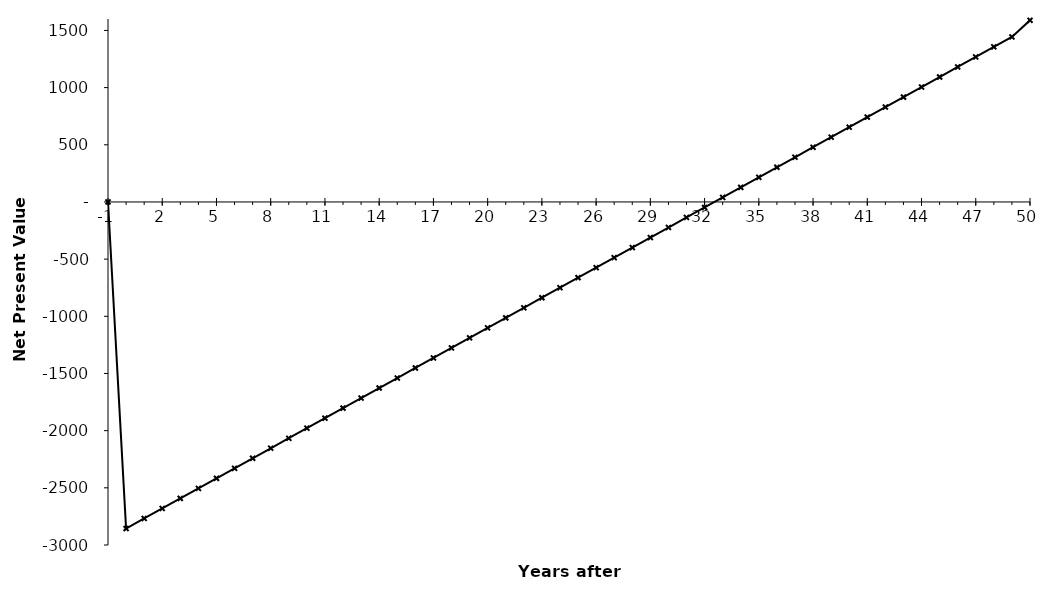
| Category | Net Present Value |
|---|---|
| -1.0 | 0 |
| 0.0 | -2855942986.625 |
| 1.0 | -2768194553.788 |
| 2.0 | -2680446120.951 |
| 3.0 | -2592697688.114 |
| 4.0 | -2504949255.277 |
| 5.0 | -2417200822.44 |
| 6.0 | -2329452389.603 |
| 7.0 | -2241703956.766 |
| 8.0 | -2153955523.929 |
| 9.0 | -2066207091.093 |
| 10.0 | -1978458658.256 |
| 11.0 | -1890710225.419 |
| 12.0 | -1802961792.582 |
| 13.0 | -1715213359.745 |
| 14.0 | -1627464926.908 |
| 15.0 | -1539716494.071 |
| 16.0 | -1451968061.234 |
| 17.0 | -1364219628.397 |
| 18.0 | -1276471195.56 |
| 19.0 | -1188722762.723 |
| 20.0 | -1100974329.886 |
| 21.0 | -1013225897.049 |
| 22.0 | -925477464.212 |
| 23.0 | -837729031.375 |
| 24.0 | -749980598.538 |
| 25.0 | -662232165.701 |
| 26.0 | -574483732.864 |
| 27.0 | -486735300.027 |
| 28.0 | -398986867.19 |
| 29.0 | -311238434.353 |
| 30.0 | -223490001.516 |
| 31.0 | -135741568.679 |
| 32.0 | -47993135.842 |
| 33.0 | 39755296.995 |
| 34.0 | 127503729.832 |
| 35.0 | 215252162.668 |
| 36.0 | 303000595.505 |
| 37.0 | 390749028.342 |
| 38.0 | 478497461.179 |
| 39.0 | 566245894.016 |
| 40.0 | 653994326.853 |
| 41.0 | 741742759.69 |
| 42.0 | 829491192.527 |
| 43.0 | 917239625.364 |
| 44.0 | 1004988058.201 |
| 45.0 | 1092736491.038 |
| 46.0 | 1180484923.875 |
| 47.0 | 1268233356.712 |
| 48.0 | 1355981789.549 |
| 49.0 | 1443730222.386 |
| 50.0 | 1588570222.317 |